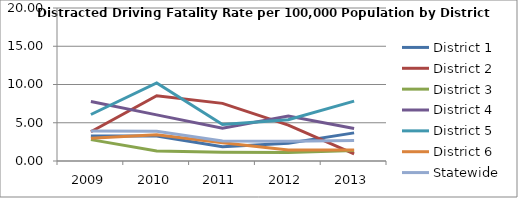
| Category | District 1 | District 2 | District 3 | District 4 | District 5 | District 6 | Statewide |
|---|---|---|---|---|---|---|---|
| 2009.0 | 3.276 | 3.828 | 2.791 | 7.778 | 6.078 | 2.964 | 3.937 |
| 2010.0 | 3.253 | 8.538 | 1.312 | 6.032 | 10.207 | 3.423 | 3.881 |
| 2011.0 | 1.864 | 7.532 | 1.142 | 4.278 | 4.781 | 2.389 | 2.629 |
| 2012.0 | 2.321 | 4.695 | 1.126 | 5.877 | 5.397 | 1.432 | 2.587 |
| 2013.0 | 3.677 | 0.938 | 1.384 | 4.236 | 7.825 | 1.425 | 2.695 |